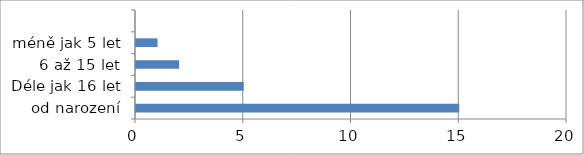
| Category | Series 0 |
|---|---|
| od narození | 15 |
| Déle jak 16 let | 5 |
| 6 až 15 let | 2 |
| méně jak 5 let | 1 |